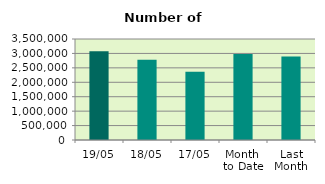
| Category | Series 0 |
|---|---|
| 19/05 | 3075936 |
| 18/05 | 2780918 |
| 17/05 | 2369240 |
| Month 
to Date | 2977058.571 |
| Last
Month | 2895009.158 |